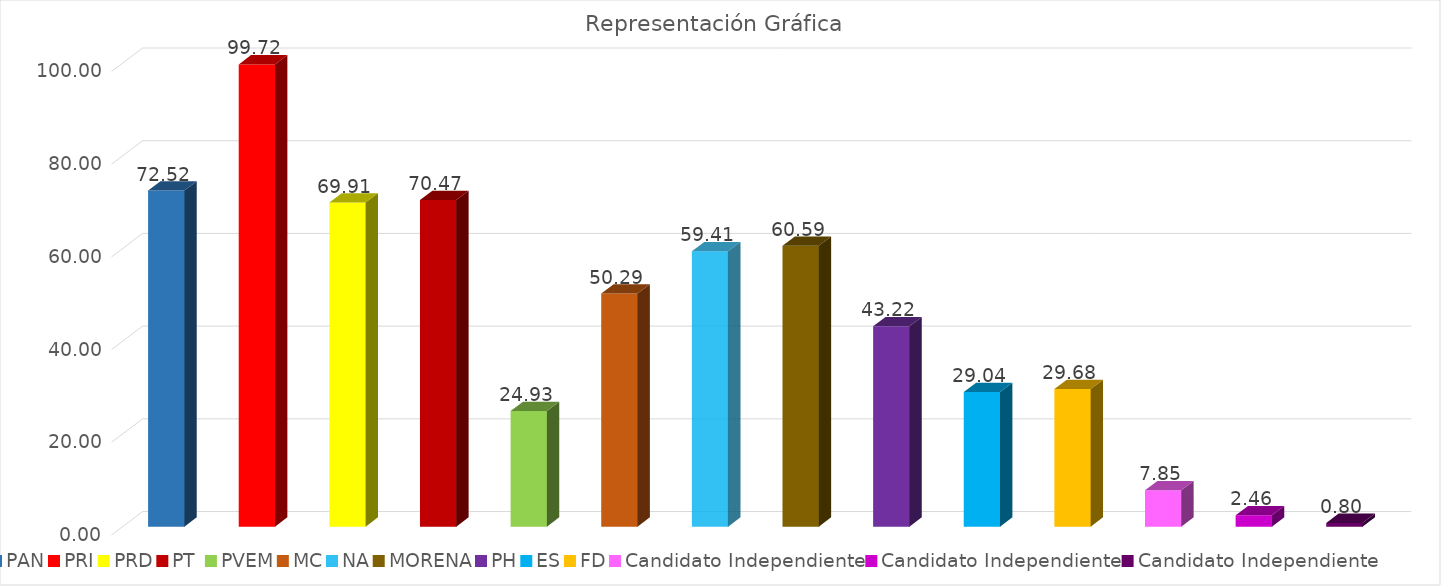
| Category | Series 0 |
|---|---|
| PAN | 72.52 |
| PRI | 99.723 |
| PRD | 69.913 |
| PT  | 70.473 |
| PVEM | 24.933 |
| MC | 50.29 |
| NA | 59.407 |
| MORENA | 60.59 |
| PH | 43.22 |
| ES | 29.037 |
| FD | 29.683 |
| Candidato Independiente | 7.852 |
| Candidato Independiente | 2.457 |
| Candidato Independiente | 0.8 |